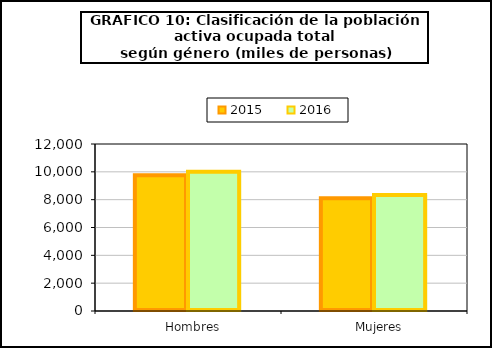
| Category | 2015 | 2016 |
|---|---|---|
|    Hombres | 9760.35 | 10000.8 |
|    Mujeres | 8105.7 | 8340.8 |